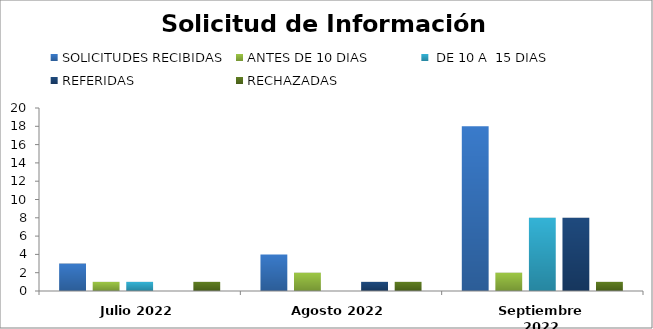
| Category | SOLICITUDES RECIBIDAS | ANTES DE 10 DIAS |  DE 10 A  15 DIAS  | REFERIDAS | RECHAZADAS | FUERA DE PLAZO |
|---|---|---|---|---|---|---|
| Julio 2022 | 3 | 1 | 1 | 0 | 1 |  |
| Agosto 2022 | 4 | 2 | 0 | 1 | 1 |  |
| Septiembre 2022 | 18 | 2 | 8 | 8 | 1 |  |